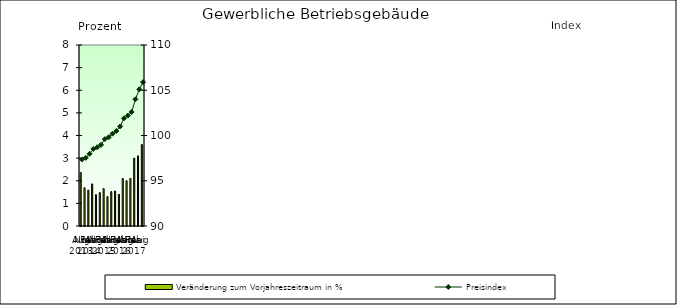
| Category | Veränderung zum Vorjahreszeitraum in % |
|---|---|
| 0 | 2.365 |
| 1 | 1.689 |
| 2 | 1.586 |
| 3 | 1.86 |
| 4 | 1.386 |
| 5 | 1.476 |
| 6 | 1.653 |
| 7 | 1.299 |
| 8 | 1.519 |
| 9 | 1.546 |
| 10 | 1.4 |
| 11 | 2.1 |
| 12 | 2 |
| 13 | 2.1 |
| 14 | 3 |
| 15 | 3.1 |
| 16 | 3.6 |